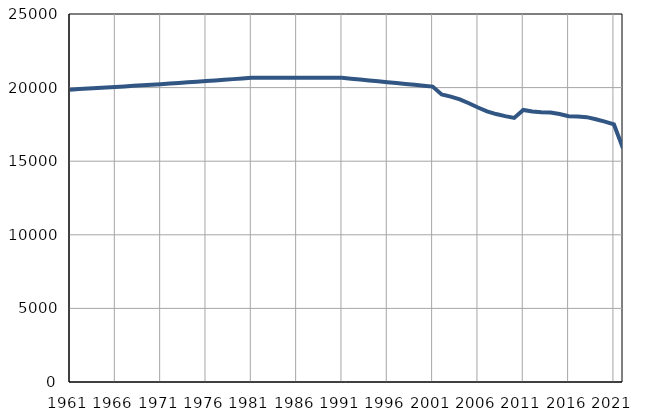
| Category | Број
становника |
|---|---|
| 1961.0 | 19860 |
| 1962.0 | 19897 |
| 1963.0 | 19934 |
| 1964.0 | 19970 |
| 1965.0 | 20007 |
| 1966.0 | 20044 |
| 1967.0 | 20081 |
| 1968.0 | 20118 |
| 1969.0 | 20154 |
| 1970.0 | 20191 |
| 1971.0 | 20228 |
| 1972.0 | 20272 |
| 1973.0 | 20316 |
| 1974.0 | 20359 |
| 1975.0 | 20401 |
| 1976.0 | 20446 |
| 1977.0 | 20489 |
| 1978.0 | 20533 |
| 1979.0 | 20576 |
| 1980.0 | 20620 |
| 1981.0 | 20663 |
| 1982.0 | 20663 |
| 1983.0 | 20663 |
| 1984.0 | 20663 |
| 1985.0 | 20663 |
| 1986.0 | 20663 |
| 1987.0 | 20662 |
| 1988.0 | 20662 |
| 1989.0 | 20662 |
| 1990.0 | 20662 |
| 1991.0 | 20662 |
| 1992.0 | 20603 |
| 1993.0 | 20544 |
| 1994.0 | 20484 |
| 1995.0 | 20425 |
| 1996.0 | 20365 |
| 1997.0 | 20306 |
| 1998.0 | 20246 |
| 1999.0 | 20187 |
| 2000.0 | 20128 |
| 2001.0 | 20068 |
| 2002.0 | 19534 |
| 2003.0 | 19383 |
| 2004.0 | 19200 |
| 2005.0 | 18939 |
| 2006.0 | 18645 |
| 2007.0 | 18389 |
| 2008.0 | 18202 |
| 2009.0 | 18061 |
| 2010.0 | 17941 |
| 2011.0 | 18482 |
| 2012.0 | 18376 |
| 2013.0 | 18319 |
| 2014.0 | 18305 |
| 2015.0 | 18208 |
| 2016.0 | 18059 |
| 2017.0 | 18030 |
| 2018.0 | 17991 |
| 2019.0 | 17846 |
| 2020.0 | 17690 |
| 2021.0 | 17497 |
| 2022.0 | 15873 |